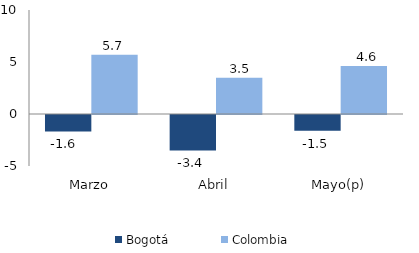
| Category | Bogotá | Colombia |
|---|---|---|
| Marzo | -1.577 | 5.692 |
| Abril | -3.413 | 3.475 |
| Mayo(p) | -1.514 | 4.627 |